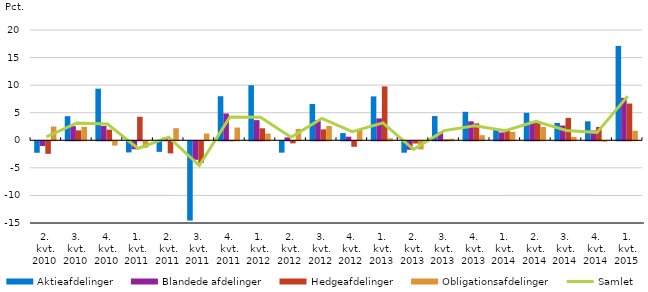
| Category | Aktieafdelinger | Blandede afdelinger | Hedgeafdelinger | Obligationsafdelinger |
|---|---|---|---|---|
| 2. kvt. 2010 | -2.083 | -0.863 | -2.272 | 2.499 |
| 3. kvt. 2010 | 4.373 | 2.561 | 1.801 | 2.448 |
| 4. kvt. 2010 | 9.361 | 2.609 | 1.923 | -0.785 |
| 1. kvt. 2011 | -2.021 | -1.448 | 4.268 | -1.169 |
| 2. kvt. 2011 | -1.918 | 0.487 | -2.194 | 2.197 |
| 3. kvt. 2011 | -14.376 | -3.356 | -3.916 | 1.22 |
| 4. kvt. 2011 | 7.995 | 4.864 | 0.066 | 2.312 |
| 1. kvt. 2012 | 9.985 | 3.653 | 2.177 | 1.226 |
| 2. kvt. 2012 | -2.062 | 0.529 | -0.384 | 2.049 |
| 3. kvt. 2012 | 6.575 | 3.664 | 1.975 | 2.589 |
| 4. kvt. 2012 | 1.304 | 0.651 | -0.993 | 1.883 |
| 1. kvt. 2013 | 7.963 | 3.967 | 9.776 | 0.359 |
| 2. kvt. 2013 | -2.068 | -1.532 | -0.408 | -1.47 |
| 3. kvt. 2013 | 4.392 | 1.448 | 0.142 | 0.283 |
| 4. kvt. 2013 | 5.169 | 3.441 | 3.069 | 0.921 |
| 1. kvt. 2014 | 2.178 | 1.423 | 1.773 | 1.538 |
| 2. kvt. 2014 | 4.985 | 3.348 | 3.457 | 2.407 |
| 3. kvt. 2014 | 3.151 | 2.671 | 4.061 | 0.614 |
| 4. kvt. 2014 | 3.447 | 1.782 | 2.428 | -0.101 |
| 1. kvt. 2015 | 17.124 | 7.694 | 6.663 | 1.727 |